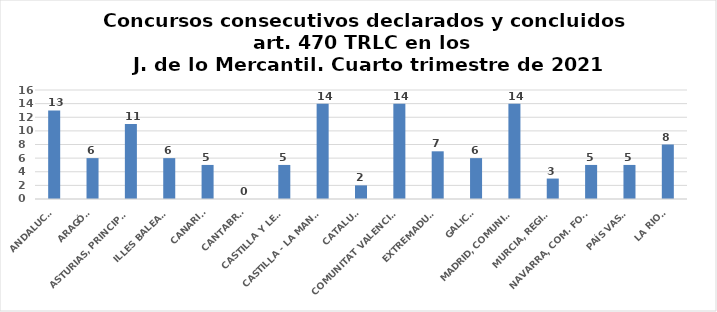
| Category | Series 0 |
|---|---|
| ANDALUCÍA | 13 |
| ARAGÓN | 6 |
| ASTURIAS, PRINCIPADO | 11 |
| ILLES BALEARS | 6 |
| CANARIAS | 5 |
| CANTABRIA | 0 |
| CASTILLA Y LEÓN | 5 |
| CASTILLA - LA MANCHA | 14 |
| CATALUÑA | 2 |
| COMUNITAT VALENCIANA | 14 |
| EXTREMADURA | 7 |
| GALICIA | 6 |
| MADRID, COMUNIDAD | 14 |
| MURCIA, REGIÓN | 3 |
| NAVARRA, COM. FORAL | 5 |
| PAÍS VASCO | 5 |
| LA RIOJA | 8 |